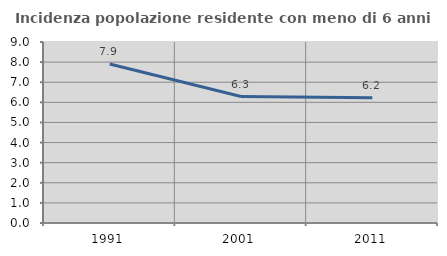
| Category | Incidenza popolazione residente con meno di 6 anni |
|---|---|
| 1991.0 | 7.909 |
| 2001.0 | 6.287 |
| 2011.0 | 6.231 |